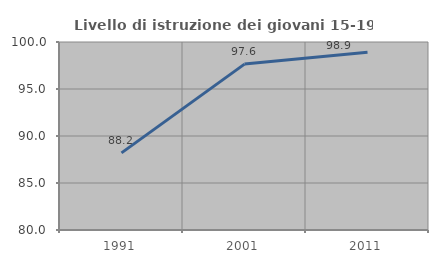
| Category | Livello di istruzione dei giovani 15-19 anni |
|---|---|
| 1991.0 | 88.206 |
| 2001.0 | 97.647 |
| 2011.0 | 98.901 |